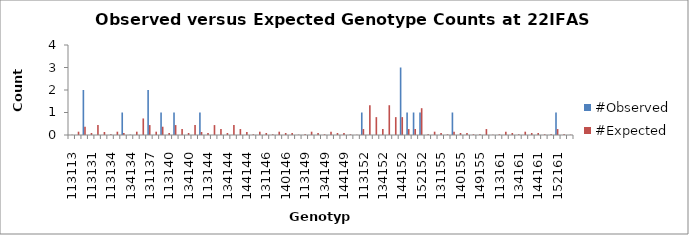
| Category | #Observed | #Expected |
|---|---|---|
| 113113.0 | 0 | 0.015 |
| 113125.0 | 0 | 0.147 |
| 125125.0 | 2 | 0.368 |
| 113131.0 | 0 | 0.088 |
| 125131.0 | 0 | 0.441 |
| 131131.0 | 0 | 0.132 |
| 113134.0 | 0 | 0.029 |
| 125134.0 | 0 | 0.147 |
| 131134.0 | 1 | 0.088 |
| 134134.0 | 0 | 0.015 |
| 113137.0 | 0 | 0.147 |
| 125137.0 | 0 | 0.735 |
| 131137.0 | 2 | 0.441 |
| 134137.0 | 0 | 0.147 |
| 137137.0 | 1 | 0.368 |
| 113140.0 | 0 | 0.088 |
| 125140.0 | 1 | 0.441 |
| 131140.0 | 0 | 0.265 |
| 134140.0 | 0 | 0.088 |
| 137140.0 | 0 | 0.441 |
| 140140.0 | 1 | 0.132 |
| 113144.0 | 0 | 0.088 |
| 125144.0 | 0 | 0.441 |
| 131144.0 | 0 | 0.265 |
| 134144.0 | 0 | 0.088 |
| 137144.0 | 0 | 0.441 |
| 140144.0 | 0 | 0.265 |
| 144144.0 | 0 | 0.132 |
| 113146.0 | 0 | 0.029 |
| 125146.0 | 0 | 0.147 |
| 131146.0 | 0 | 0.088 |
| 134146.0 | 0 | 0.029 |
| 137146.0 | 0 | 0.147 |
| 140146.0 | 0 | 0.088 |
| 144146.0 | 0 | 0.088 |
| 146146.0 | 0 | 0.015 |
| 113149.0 | 0 | 0.029 |
| 125149.0 | 0 | 0.147 |
| 131149.0 | 0 | 0.088 |
| 134149.0 | 0 | 0.029 |
| 137149.0 | 0 | 0.147 |
| 140149.0 | 0 | 0.088 |
| 144149.0 | 0 | 0.088 |
| 146149.0 | 0 | 0.029 |
| 149149.0 | 0 | 0.015 |
| 113152.0 | 1 | 0.265 |
| 125152.0 | 0 | 1.324 |
| 131152.0 | 0 | 0.794 |
| 134152.0 | 0 | 0.265 |
| 137152.0 | 0 | 1.324 |
| 140152.0 | 0 | 0.794 |
| 144152.0 | 3 | 0.794 |
| 146152.0 | 1 | 0.265 |
| 149152.0 | 1 | 0.265 |
| 152152.0 | 1 | 1.191 |
| 113155.0 | 0 | 0.029 |
| 125155.0 | 0 | 0.147 |
| 131155.0 | 0 | 0.088 |
| 134155.0 | 0 | 0.029 |
| 137155.0 | 1 | 0.147 |
| 140155.0 | 0 | 0.088 |
| 144155.0 | 0 | 0.088 |
| 146155.0 | 0 | 0.029 |
| 149155.0 | 0 | 0.029 |
| 152155.0 | 0 | 0.265 |
| 155155.0 | 0 | 0.015 |
| 113161.0 | 0 | 0.029 |
| 125161.0 | 0 | 0.147 |
| 131161.0 | 0 | 0.088 |
| 134161.0 | 0 | 0.029 |
| 137161.0 | 0 | 0.147 |
| 140161.0 | 0 | 0.088 |
| 144161.0 | 0 | 0.088 |
| 146161.0 | 0 | 0.029 |
| 149161.0 | 0 | 0.029 |
| 152161.0 | 1 | 0.265 |
| 155161.0 | 0 | 0.029 |
| 161161.0 | 0 | 0.015 |